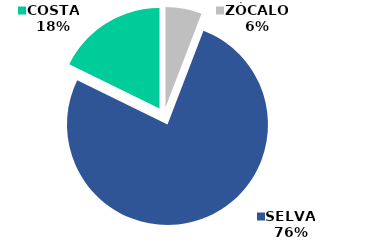
| Category | Series 0 |
|---|---|
| ZÓCALO | 2656578 |
| SELVA | 34865941 |
| COSTA | 8089064 |